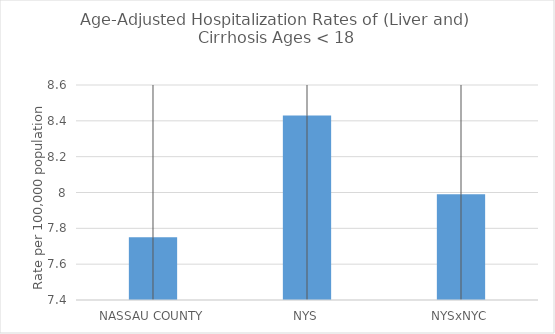
| Category | Age-Adjusted Hospitalization Rates of (Liver and) Cirrhosis Ages < 18 |
|---|---|
| NASSAU COUNTY | 7.751 |
| NYS | 8.43 |
| NYSxNYC | 7.99 |